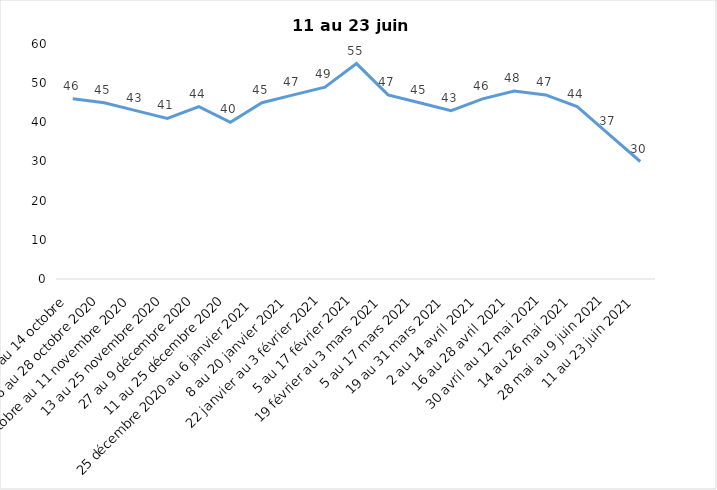
| Category | Toujours aux trois mesures |
|---|---|
| 2 au 14 octobre  | 46 |
| 16 au 28 octobre 2020 | 45 |
| 30 octobre au 11 novembre 2020 | 43 |
| 13 au 25 novembre 2020 | 41 |
| 27 au 9 décembre 2020 | 44 |
| 11 au 25 décembre 2020 | 40 |
| 25 décembre 2020 au 6 janvier 2021 | 45 |
| 8 au 20 janvier 2021 | 47 |
| 22 janvier au 3 février 2021 | 49 |
| 5 au 17 février 2021 | 55 |
| 19 février au 3 mars 2021 | 47 |
| 5 au 17 mars 2021 | 45 |
| 19 au 31 mars 2021 | 43 |
| 2 au 14 avril 2021 | 46 |
| 16 au 28 avril 2021 | 48 |
| 30 avril au 12 mai 2021 | 47 |
| 14 au 26 mai 2021 | 44 |
| 28 mai au 9 juin 2021 | 37 |
| 11 au 23 juin 2021 | 30 |